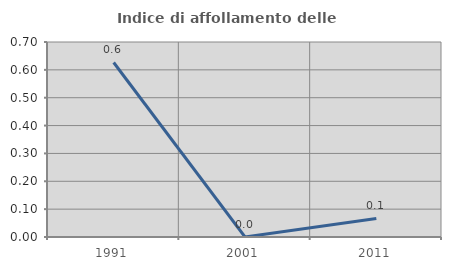
| Category | Indice di affollamento delle abitazioni  |
|---|---|
| 1991.0 | 0.626 |
| 2001.0 | 0 |
| 2011.0 | 0.067 |